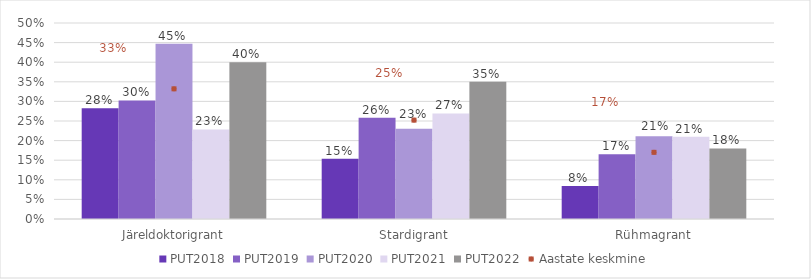
| Category | PUT2018 | PUT2019 | PUT2020 | PUT2021 | PUT2022 |
|---|---|---|---|---|---|
| Järeldoktorigrant | 0.283 | 0.302 | 0.447 | 0.229 | 0.4 |
| Stardigrant | 0.154 | 0.258 | 0.23 | 0.269 | 0.35 |
| Rühmagrant | 0.084 | 0.165 | 0.211 | 0.21 | 0.18 |